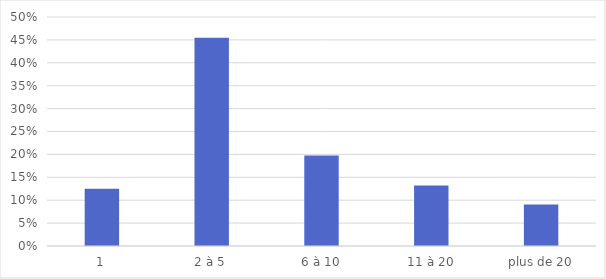
| Category | Series 0 |
|---|---|
| 1 | 0.125 |
| 2 à 5 | 0.455 |
| 6 à 10 | 0.198 |
| 11 à 20 | 0.132 |
| plus de 20 | 0.091 |